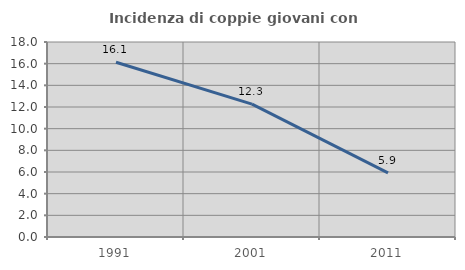
| Category | Incidenza di coppie giovani con figli |
|---|---|
| 1991.0 | 16.129 |
| 2001.0 | 12.261 |
| 2011.0 | 5.926 |